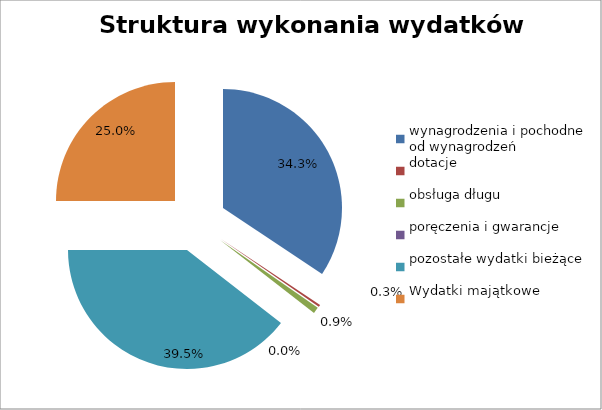
| Category | Wydatki
 wykonane |
|---|---|
| wynagrodzenia i pochodne od wynagrodzeń | 6121185.83 |
| dotacje | 56618.2 |
| obsługa długu | 152016.65 |
| poręczenia i gwarancje | 0 |
| pozostałe wydatki bieżące | 7039431.39 |
| Wydatki majątkowe       | 4456554.05 |